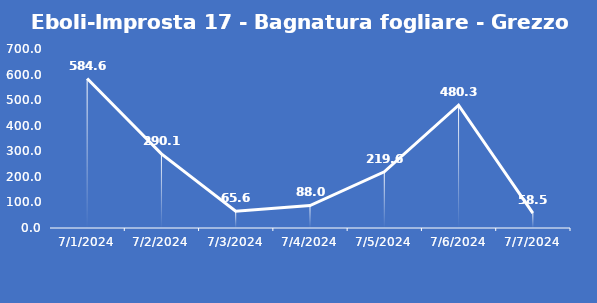
| Category | Eboli-Improsta 17 - Bagnatura fogliare - Grezzo (min) |
|---|---|
| 7/1/24 | 584.6 |
| 7/2/24 | 290.1 |
| 7/3/24 | 65.6 |
| 7/4/24 | 88 |
| 7/5/24 | 219.6 |
| 7/6/24 | 480.3 |
| 7/7/24 | 58.5 |